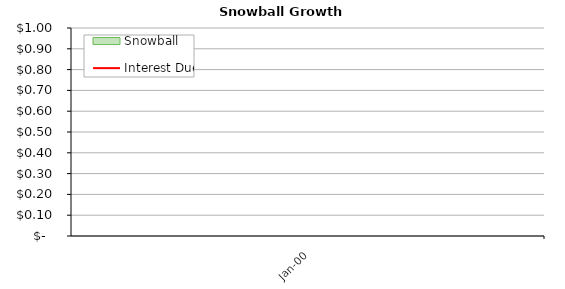
| Category | Snowball |
|---|---|
| #N/A | 0 |
| #N/A | 0 |
| #N/A | 0 |
| #N/A | 0 |
| #N/A | 0 |
| #N/A | 0 |
| #N/A | 0 |
| #N/A | 0 |
| #N/A | 0 |
| #N/A | 0 |
| #N/A | 0 |
| #N/A | 0 |
| #N/A | 0 |
| #N/A | 0 |
| #N/A | 0 |
| #N/A | 0 |
| #N/A | 0 |
| #N/A | 0 |
| #N/A | 0 |
| #N/A | 0 |
| #N/A | 0 |
| #N/A | 0 |
| #N/A | 0 |
| #N/A | 0 |
| #N/A | 0 |
| #N/A | 0 |
| #N/A | 0 |
| #N/A | 0 |
| #N/A | 0 |
| #N/A | 0 |
| #N/A | 0 |
| #N/A | 0 |
| #N/A | 0 |
| #N/A | 0 |
| #N/A | 0 |
| #N/A | 0 |
| #N/A | 0 |
| #N/A | 0 |
| #N/A | 0 |
| #N/A | 0 |
| #N/A | 0 |
| #N/A | 0 |
| #N/A | 0 |
| #N/A | 0 |
| #N/A | 0 |
| #N/A | 0 |
| #N/A | 0 |
| #N/A | 0 |
| #N/A | 0 |
| #N/A | 0 |
| #N/A | 0 |
| #N/A | 0 |
| #N/A | 0 |
| #N/A | 0 |
| #N/A | 0 |
| #N/A | 0 |
| #N/A | 0 |
| #N/A | 0 |
| #N/A | 0 |
| #N/A | 0 |
| #N/A | 0 |
| #N/A | 0 |
| #N/A | 0 |
| #N/A | 0 |
| #N/A | 0 |
| #N/A | 0 |
| #N/A | 0 |
| #N/A | 0 |
| #N/A | 0 |
| #N/A | 0 |
| #N/A | 0 |
| #N/A | 0 |
| #N/A | 0 |
| #N/A | 0 |
| #N/A | 0 |
| #N/A | 0 |
| #N/A | 0 |
| #N/A | 0 |
| #N/A | 0 |
| #N/A | 0 |
| #N/A | 0 |
| #N/A | 0 |
| #N/A | 0 |
| #N/A | 0 |
| #N/A | 0 |
| #N/A | 0 |
| #N/A | 0 |
| #N/A | 0 |
| #N/A | 0 |
| #N/A | 0 |
| #N/A | 0 |
| #N/A | 0 |
| #N/A | 0 |
| #N/A | 0 |
| #N/A | 0 |
| #N/A | 0 |
| #N/A | 0 |
| #N/A | 0 |
| #N/A | 0 |
| #N/A | 0 |
| #N/A | 0 |
| #N/A | 0 |
| #N/A | 0 |
| #N/A | 0 |
| #N/A | 0 |
| #N/A | 0 |
| #N/A | 0 |
| #N/A | 0 |
| #N/A | 0 |
| #N/A | 0 |
| #N/A | 0 |
| #N/A | 0 |
| #N/A | 0 |
| #N/A | 0 |
| #N/A | 0 |
| #N/A | 0 |
| #N/A | 0 |
| #N/A | 0 |
| #N/A | 0 |
| #N/A | 0 |
| #N/A | 0 |
| #N/A | 0 |
| #N/A | 0 |
| #N/A | 0 |
| #N/A | 0 |
| #N/A | 0 |
| #N/A | 0 |
| #N/A | 0 |
| #N/A | 0 |
| #N/A | 0 |
| #N/A | 0 |
| #N/A | 0 |
| #N/A | 0 |
| #N/A | 0 |
| #N/A | 0 |
| #N/A | 0 |
| #N/A | 0 |
| #N/A | 0 |
| #N/A | 0 |
| #N/A | 0 |
| #N/A | 0 |
| #N/A | 0 |
| #N/A | 0 |
| #N/A | 0 |
| #N/A | 0 |
| #N/A | 0 |
| #N/A | 0 |
| #N/A | 0 |
| #N/A | 0 |
| #N/A | 0 |
| #N/A | 0 |
| #N/A | 0 |
| #N/A | 0 |
| #N/A | 0 |
| #N/A | 0 |
| #N/A | 0 |
| #N/A | 0 |
| #N/A | 0 |
| #N/A | 0 |
| #N/A | 0 |
| #N/A | 0 |
| #N/A | 0 |
| #N/A | 0 |
| #N/A | 0 |
| #N/A | 0 |
| #N/A | 0 |
| #N/A | 0 |
| #N/A | 0 |
| #N/A | 0 |
| #N/A | 0 |
| #N/A | 0 |
| #N/A | 0 |
| #N/A | 0 |
| #N/A | 0 |
| #N/A | 0 |
| #N/A | 0 |
| #N/A | 0 |
| #N/A | 0 |
| #N/A | 0 |
| #N/A | 0 |
| #N/A | 0 |
| #N/A | 0 |
| #N/A | 0 |
| #N/A | 0 |
| #N/A | 0 |
| #N/A | 0 |
| #N/A | 0 |
| #N/A | 0 |
| #N/A | 0 |
| #N/A | 0 |
| #N/A | 0 |
| #N/A | 0 |
| #N/A | 0 |
| #N/A | 0 |
| #N/A | 0 |
| #N/A | 0 |
| #N/A | 0 |
| #N/A | 0 |
| #N/A | 0 |
| #N/A | 0 |
| #N/A | 0 |
| #N/A | 0 |
| #N/A | 0 |
| #N/A | 0 |
| #N/A | 0 |
| #N/A | 0 |
| #N/A | 0 |
| #N/A | 0 |
| #N/A | 0 |
| #N/A | 0 |
| #N/A | 0 |
| #N/A | 0 |
| #N/A | 0 |
| #N/A | 0 |
| #N/A | 0 |
| #N/A | 0 |
| #N/A | 0 |
| #N/A | 0 |
| #N/A | 0 |
| #N/A | 0 |
| #N/A | 0 |
| #N/A | 0 |
| #N/A | 0 |
| #N/A | 0 |
| #N/A | 0 |
| #N/A | 0 |
| #N/A | 0 |
| #N/A | 0 |
| #N/A | 0 |
| #N/A | 0 |
| #N/A | 0 |
| #N/A | 0 |
| #N/A | 0 |
| #N/A | 0 |
| #N/A | 0 |
| #N/A | 0 |
| #N/A | 0 |
| #N/A | 0 |
| #N/A | 0 |
| #N/A | 0 |
| #N/A | 0 |
| #N/A | 0 |
| #N/A | 0 |
| #N/A | 0 |
| #N/A | 0 |
| #N/A | 0 |
| #N/A | 0 |
| #N/A | 0 |
| #N/A | 0 |
| #N/A | 0 |
| #N/A | 0 |
| #N/A | 0 |
| #N/A | 0 |
| #N/A | 0 |
| #N/A | 0 |
| #N/A | 0 |
| #N/A | 0 |
| #N/A | 0 |
| #N/A | 0 |
| #N/A | 0 |
| #N/A | 0 |
| #N/A | 0 |
| #N/A | 0 |
| #N/A | 0 |
| #N/A | 0 |
| #N/A | 0 |
| #N/A | 0 |
| #N/A | 0 |
| #N/A | 0 |
| #N/A | 0 |
| #N/A | 0 |
| #N/A | 0 |
| #N/A | 0 |
| #N/A | 0 |
| #N/A | 0 |
| #N/A | 0 |
| #N/A | 0 |
| #N/A | 0 |
| #N/A | 0 |
| #N/A | 0 |
| #N/A | 0 |
| #N/A | 0 |
| #N/A | 0 |
| #N/A | 0 |
| #N/A | 0 |
| #N/A | 0 |
| #N/A | 0 |
| #N/A | 0 |
| #N/A | 0 |
| #N/A | 0 |
| #N/A | 0 |
| #N/A | 0 |
| #N/A | 0 |
| #N/A | 0 |
| #N/A | 0 |
| #N/A | 0 |
| #N/A | 0 |
| #N/A | 0 |
| #N/A | 0 |
| #N/A | 0 |
| #N/A | 0 |
| #N/A | 0 |
| #N/A | 0 |
| #N/A | 0 |
| #N/A | 0 |
| #N/A | 0 |
| #N/A | 0 |
| #N/A | 0 |
| #N/A | 0 |
| #N/A | 0 |
| #N/A | 0 |
| #N/A | 0 |
| #N/A | 0 |
| #N/A | 0 |
| #N/A | 0 |
| #N/A | 0 |
| #N/A | 0 |
| #N/A | 0 |
| #N/A | 0 |
| #N/A | 0 |
| #N/A | 0 |
| #N/A | 0 |
| #N/A | 0 |
| #N/A | 0 |
| #N/A | 0 |
| #N/A | 0 |
| #N/A | 0 |
| #N/A | 0 |
| #N/A | 0 |
| #N/A | 0 |
| #N/A | 0 |
| #N/A | 0 |
| #N/A | 0 |
| #N/A | 0 |
| #N/A | 0 |
| #N/A | 0 |
| #N/A | 0 |
| #N/A | 0 |
| #N/A | 0 |
| #N/A | 0 |
| #N/A | 0 |
| #N/A | 0 |
| #N/A | 0 |
| #N/A | 0 |
| #N/A | 0 |
| #N/A | 0 |
| #N/A | 0 |
| #N/A | 0 |
| #N/A | 0 |
| #N/A | 0 |
| #N/A | 0 |
| #N/A | 0 |
| #N/A | 0 |
| #N/A | 0 |
| #N/A | 0 |
| #N/A | 0 |
| #N/A | 0 |
| #N/A | 0 |
| #N/A | 0 |
| #N/A | 0 |